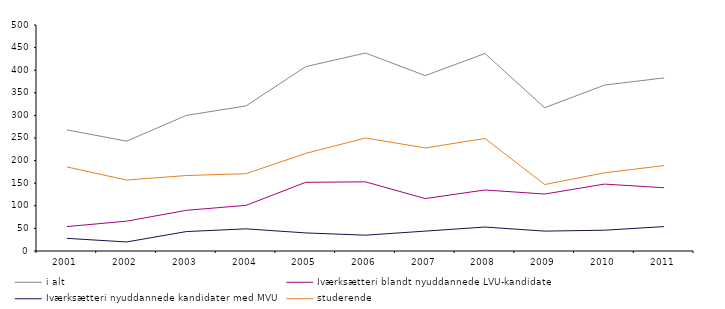
| Category | i alt | Iværksætteri blandt nyuddannede LVU-kandidater | Iværksætteri nyuddannede kandidater med MVU | studerende |
|---|---|---|---|---|
| 2001.0 | 268 | 54 | 28 | 186 |
| 2002.0 | 243 | 66 | 20 | 157 |
| 2003.0 | 300 | 90 | 43 | 167 |
| 2004.0 | 321 | 101 | 49 | 171 |
| 2005.0 | 408 | 152 | 40 | 216 |
| 2006.0 | 438 | 153 | 35 | 250 |
| 2007.0 | 388 | 116 | 44 | 228 |
| 2008.0 | 437 | 135 | 53 | 249 |
| 2009.0 | 317 | 126 | 44 | 147 |
| 2010.0 | 367 | 148 | 46 | 173 |
| 2011.0 | 383 | 140 | 54 | 189 |